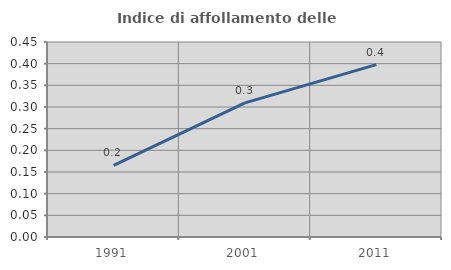
| Category | Indice di affollamento delle abitazioni  |
|---|---|
| 1991.0 | 0.165 |
| 2001.0 | 0.309 |
| 2011.0 | 0.398 |